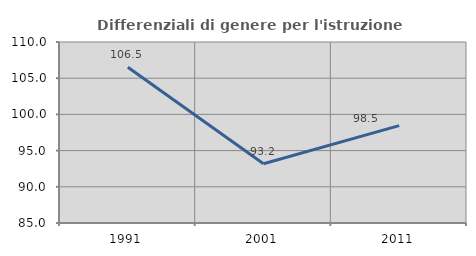
| Category | Differenziali di genere per l'istruzione superiore |
|---|---|
| 1991.0 | 106.512 |
| 2001.0 | 93.186 |
| 2011.0 | 98.456 |